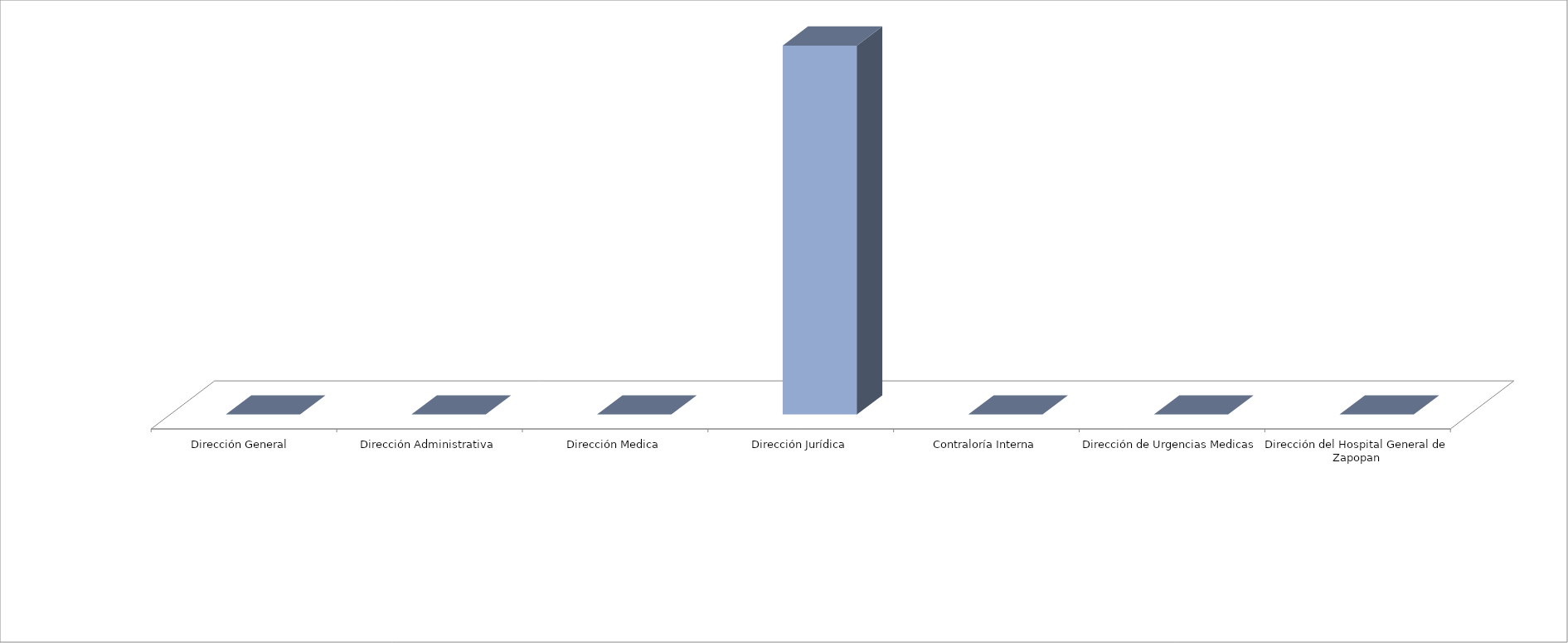
| Category | Series 0 | Series 1 |
|---|---|---|
| Dirección General  |  | 0 |
| Dirección Administrativa |  | 0 |
| Dirección Medica |  | 0 |
| Dirección Jurídica |  | 39 |
| Contraloría Interna |  | 0 |
| Dirección de Urgencias Medicas |  | 0 |
| Dirección del Hospital General de Zapopan |  | 0 |